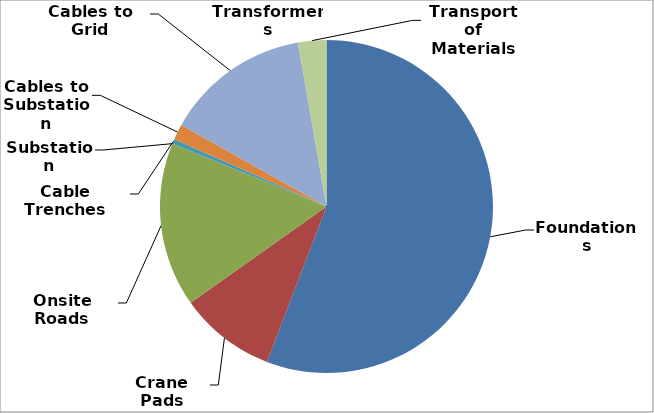
| Category | Series 0 |
|---|---|
| Foundations | 10509.89 |
| Crane Pads | 1762.12 |
| Onsite Roads | 3006.625 |
| Substation | 2.898 |
| Cable Trenches | 84 |
| Cables to Substation | 286.772 |
| Cables to Grid | 2657.631 |
| Transformers | 0 |
| Transport of Materials | 517.188 |